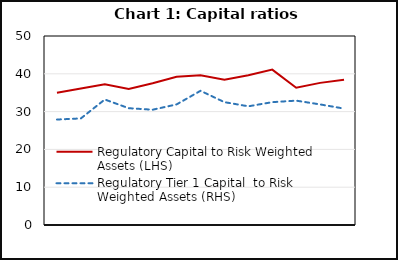
| Category | Regulatory Capital to Risk Weighted Assets (LHS) | Regulatory Tier 1 Capital  to Risk Weighted Assets (RHS) |
|---|---|---|
| nan | 35 | 27.9 |
| 2019.0 | 36.1 | 28.2 |
| nan | 37.2 | 33.2 |
| nan | 36 | 30.9 |
| nan | 37.5 | 30.5 |
| 2020.0 | 39.2 | 31.9 |
| nan | 39.6 | 35.5 |
| nan | 38.4 | 32.5 |
| nan | 39.6 | 31.4 |
| 2021.0 | 41.1 | 32.5 |
| nan | 36.3 | 32.9 |
| nan | 37.6 | 31.9 |
| 2022.0 | 38.4 | 30.8 |